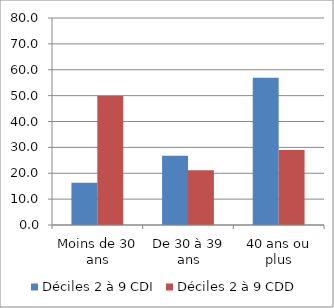
| Category | Déciles 2 à 9 CDI | Déciles 2 à 9 CDD |
|---|---|---|
| Moins de 30 ans | 16.328 | 49.894 |
| De 30 à 39 ans | 26.805 | 21.119 |
| 40 ans ou plus | 56.868 | 28.987 |